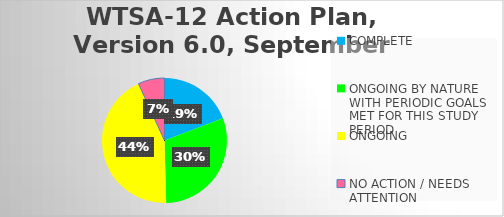
| Category | WTSA-12 Action Plan, Version 6.0, September 2016 |
|---|---|
| COMPLETE | 45 |
| ONGOING BY NATURE WITH PERIODIC GOALS MET FOR THIS STUDY PERIOD | 71 |
| ONGOING | 102 |
| NO ACTION / NEEDS ATTENTION | 16 |